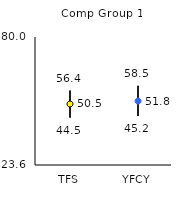
| Category | 25th | 75th | Mean |
|---|---|---|---|
| TFS | 44.5 | 56.4 | 50.48 |
| YFCY | 45.2 | 58.5 | 51.77 |